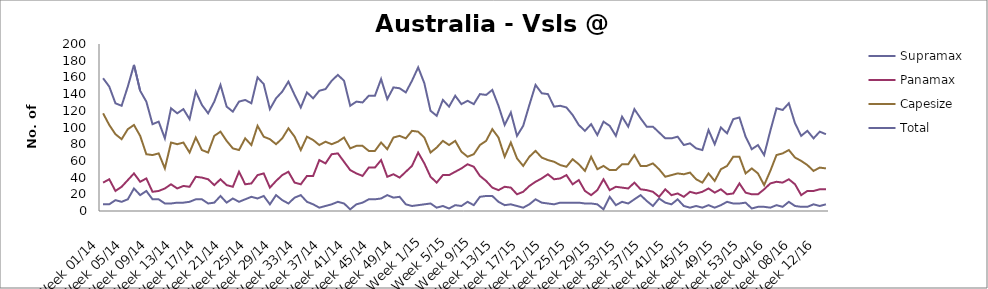
| Category | Supramax | Panamax | Capesize | Total |
|---|---|---|---|---|
| Week 01/14 | 8 | 34 | 117 | 159 |
| Week 02/14 | 8 | 38 | 103 | 149 |
| Week 03/14 | 13 | 24 | 92 | 129 |
| Week 04/14 | 11 | 29 | 86 | 126 |
| Week 05/14 | 14 | 37 | 98 | 149 |
| Week 06/14 | 27 | 45 | 103 | 175 |
| Week 07/14 | 19 | 35 | 90 | 144 |
| Week 08/14 | 24 | 39 | 68 | 131 |
| Week 09/14 | 14 | 23 | 67 | 104 |
| Week 10/14 | 14 | 24 | 69 | 107 |
| Week 11/14 | 9 | 27 | 51 | 87 |
| Week 12/14 | 9 | 32 | 82 | 123 |
| Week 13/14 | 10 | 27 | 80 | 117 |
| Week 14/14 | 10 | 30 | 82 | 122 |
| Week 15/14 | 11 | 29 | 70 | 110 |
| Week 16/14 | 14 | 41 | 88 | 143 |
| Week 17/14 | 14 | 40 | 73 | 127 |
| Week 18/14 | 9 | 38 | 70 | 117 |
| Week 19/14 | 10 | 31 | 90 | 131 |
| Week 20/14 | 18 | 38 | 95 | 151 |
| Week 21/14 | 10 | 31 | 84 | 125 |
| Week 22/14 | 15 | 29 | 75 | 119 |
| Week 23/14 | 11 | 47 | 73 | 131 |
| Week 24/14 | 14 | 32 | 87 | 133 |
| Week 25/14 | 17 | 33 | 79 | 129 |
| Week 26/14 | 15 | 43 | 102 | 160 |
| Week 27/14 | 18 | 45 | 89 | 152 |
| Week 28/14 | 8 | 28 | 86 | 122 |
| Week 29/14 | 19 | 36 | 80 | 135 |
| Week 30/14 | 13 | 43 | 87 | 143 |
| Week 31/14 | 9 | 47 | 99 | 155 |
| Week 32/14 | 16 | 34 | 89 | 139 |
| Week 33/14 | 19 | 32 | 73 | 124 |
| Week 34/14 | 11 | 42 | 89 | 142 |
| Week 35/14 | 8 | 42 | 85 | 135 |
| Week 36/14 | 4 | 61 | 79 | 144 |
| Week 37/14 | 6 | 57 | 83 | 146 |
| Week 38/14 | 8 | 68 | 80 | 156 |
| Week 39/14 | 11 | 69 | 83 | 163 |
| Week 40/14 | 9 | 59 | 88 | 156 |
| Week 41/14 | 2 | 49 | 75 | 126 |
| Week 42/14 | 8 | 45 | 78 | 131 |
| Week 43/14 | 10 | 42 | 78 | 130 |
| Week 44/14 | 14 | 52 | 72 | 138 |
| Week 45/14 | 14 | 52 | 72 | 138 |
| Week 46/14 | 15 | 61 | 82 | 158 |
| Week 47/14 | 19 | 41 | 74 | 134 |
| Week 48/14 | 16 | 44 | 88 | 148 |
| Week 49/14 | 17 | 40 | 90 | 147 |
| Week 50/14 | 8 | 47 | 87 | 142 |
| Week 51/14 | 6 | 54 | 96 | 156 |
| Week 52/14 | 7 | 70 | 95 | 172 |
| Week 1/15 | 8 | 57 | 88 | 153 |
| Week 2/15 | 9 | 41 | 70 | 120 |
| Week 3/15 | 4 | 34 | 76 | 114 |
| Week 4/15 | 6 | 43 | 84 | 133 |
| Week 5/15 | 3 | 43 | 79 | 125 |
| Week 6/15 | 7 | 47 | 84 | 138 |
| Week 7/15 | 6 | 51 | 71 | 128 |
| Week 8/15 | 11 | 56 | 65 | 132 |
| Week 9/15 | 7 | 53 | 68 | 128 |
| Week 10/15 | 17 | 42 | 79 | 140 |
| Week 11/15 | 18 | 36 | 84 | 139 |
| Week 12/15 | 18 | 28 | 98 | 145 |
| Week 13/15 | 11 | 25 | 88 | 126 |
| Week 14/15 | 7 | 29 | 65 | 103 |
| Week 15/15 | 8 | 28 | 82 | 118 |
| Week 16/15 | 6 | 20 | 63 | 90 |
| Week 17/15 | 4 | 23 | 54 | 102 |
| Week 18/15 | 8 | 30 | 65 | 127 |
| Week 19/15 | 14 | 35 | 72 | 151 |
| Week 20/15 | 10 | 39 | 64 | 141 |
| Week 21/15 | 9 | 44 | 61 | 140 |
| Week 22/15 | 8 | 38 | 59 | 125 |
| Week 23/15 | 10 | 39 | 55 | 126 |
| Week 24/15 | 10 | 43 | 53 | 124 |
| Week 25/15 | 10 | 32 | 62 | 115 |
| Week 26/15 | 10 | 37 | 56 | 103 |
| Week 27/15 | 9 | 24 | 48 | 96 |
| Week 28/15 | 9 | 19 | 65 | 104 |
| Week 29/15 | 8 | 25 | 50 | 91 |
| Week 30/15 | 2 | 38 | 54 | 107 |
| Week 31/15 | 17 | 25 | 49 | 102 |
| Week 32/15 | 7 | 29 | 49 | 90 |
| Week 33/15 | 11 | 28 | 56 | 113 |
| Week 34/15 | 9 | 27 | 56 | 101 |
| Week 35/15 | 14 | 34 | 67 | 122 |
| Week 36/15 | 19 | 26 | 54 | 111 |
| Week 37/15 | 12 | 25 | 54 | 101 |
| Week 38/15 | 6 | 23 | 57 | 101 |
| Week 39/15 | 15 | 17 | 50 | 94 |
| Week 40/15 | 10 | 26 | 41 | 87 |
| Week 41/15 | 8 | 19 | 43 | 87 |
| Week 42/15 | 14 | 21 | 45 | 89 |
| Week 43/15 | 6 | 17 | 44 | 79 |
| Week 44/15 | 4 | 23 | 46 | 81 |
| Week 45/15 | 6 | 21 | 38 | 75 |
| Week 46/15 | 4 | 23 | 34 | 73 |
| Week 47/15 | 7 | 27 | 45 | 97 |
| Week 48/15 | 4 | 22 | 36 | 80 |
| Week 49/15 | 7 | 26 | 50 | 100 |
| Week 50/15 | 11 | 20 | 54 | 93 |
| Week 51/15 | 9 | 21 | 65 | 110 |
| Week 52/15 | 9 | 33 | 65 | 112 |
| Week 53/15 | 10 | 22 | 45 | 89 |
| Week 01/16 | 3 | 20 | 51 | 74 |
| Week 02/16 | 5 | 20 | 45 | 79 |
| Week 03/16 | 5 | 26 | 31 | 67 |
| Week 04/16 | 4 | 33 | 48 | 96 |
| Week 05/16 | 7 | 35 | 67 | 123 |
| Week 06/16 | 5 | 34 | 69 | 121 |
| Week 07/16 | 11 | 38 | 73 | 129 |
| Week 08/16 | 6 | 32 | 64 | 105 |
| Week 09/16 | 5 | 19 | 60 | 90 |
| Week 10/16 | 5 | 24 | 55 | 96 |
| Week 11/16 | 8 | 24 | 48 | 87 |
| Week 12/16 | 6 | 26 | 52 | 95 |
| Week 13/16 | 8 | 26 | 51 | 92 |